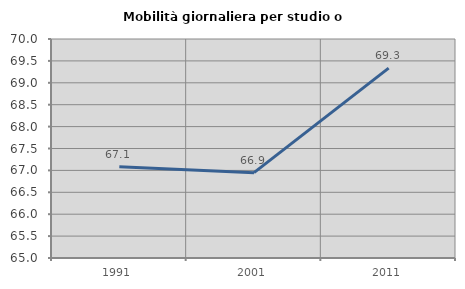
| Category | Mobilità giornaliera per studio o lavoro |
|---|---|
| 1991.0 | 67.081 |
| 2001.0 | 66.949 |
| 2011.0 | 69.334 |